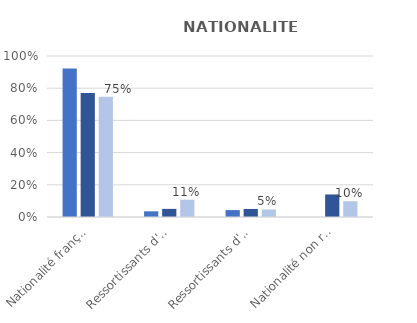
| Category | Ensemble de la population | Ensemble des victimes de crimes ou délits | Victimes de crimes ou délits à caractère raciste |
|---|---|---|---|
| Nationalité française | 0.922 | 0.77 | 0.747 |
| Ressortissants d'un pays d'Afrique | 0.035 | 0.05 | 0.108 |
| Ressortissants d'un autre pays | 0.043 | 0.05 | 0.047 |
| Nationalité non renseignée | 0 | 0.14 | 0.098 |